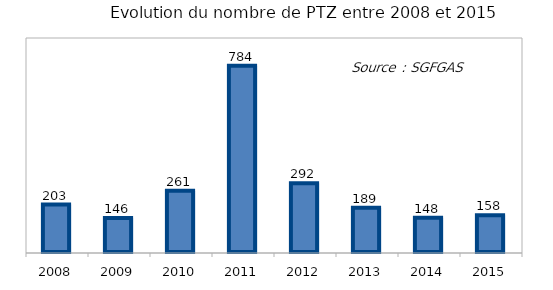
| Category | Nombre de PTZ |
|---|---|
| 2008.0 | 203 |
| 2009.0 | 146 |
| 2010.0 | 261 |
| 2011.0 | 784 |
| 2012.0 | 292 |
| 2013.0 | 189 |
| 2014.0 | 148 |
| 2015.0 | 158 |